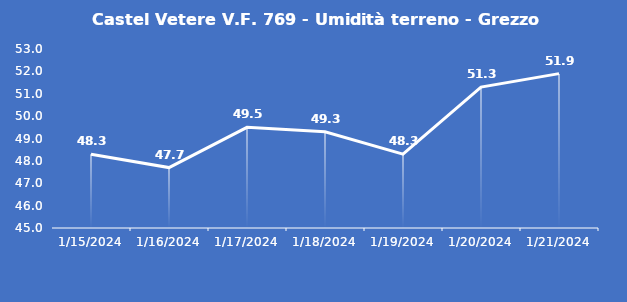
| Category | Castel Vetere V.F. 769 - Umidità terreno - Grezzo (%VWC) |
|---|---|
| 1/15/24 | 48.3 |
| 1/16/24 | 47.7 |
| 1/17/24 | 49.5 |
| 1/18/24 | 49.3 |
| 1/19/24 | 48.3 |
| 1/20/24 | 51.3 |
| 1/21/24 | 51.9 |